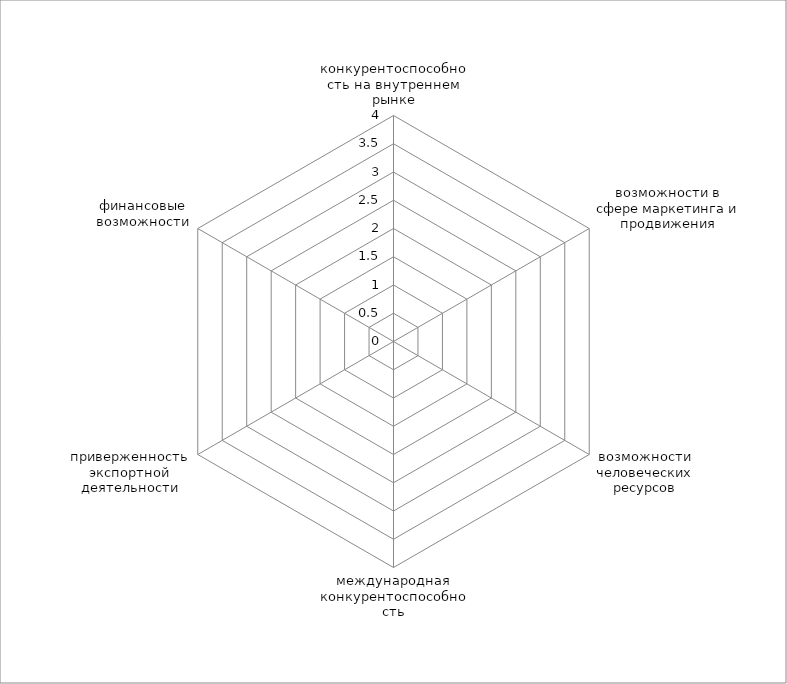
| Category | Series 0 |
|---|---|
| конкурентоспособность на внутреннем рынке | 0 |
| возможности в сфере маркетинга и продвижения | 0 |
| возможности человеческих ресурсов | 0 |
| международная конкурентоспособность | 0 |
| приверженность экспортной деятельности | 0 |
| финансовые возможности | 0 |